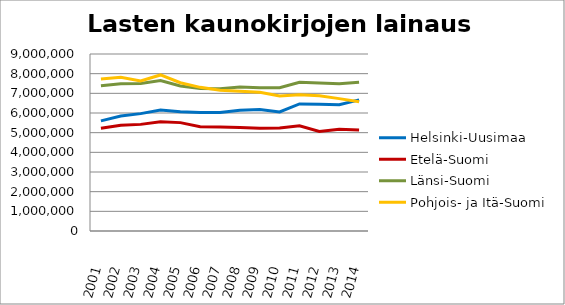
| Category | Helsinki-Uusimaa | Etelä-Suomi | Länsi-Suomi | Pohjois- ja Itä-Suomi |
|---|---|---|---|---|
| 2001.0 | 5598473 | 5223744 | 7386191 | 7727132 |
| 2002.0 | 5845775 | 5381526 | 7492269 | 7822712 |
| 2003.0 | 5967536 | 5421565 | 7502974 | 7631800 |
| 2004.0 | 6152124 | 5553256 | 7655005 | 7934424 |
| 2005.0 | 6060521 | 5510690 | 7373389 | 7538641 |
| 2006.0 | 6031595 | 5306095 | 7248917 | 7303926 |
| 2007.0 | 6019961 | 5285320 | 7233239 | 7153245 |
| 2008.0 | 6137574 | 5264498 | 7326391 | 7104299 |
| 2009.0 | 6180917 | 5230311 | 7286632 | 7055877 |
| 2010.0 | 6052951 | 5231723 | 7284008 | 6865479 |
| 2011.0 | 6459493 | 5348418 | 7564698 | 6925778 |
| 2012.0 | 6442378 | 5062158 | 7520354 | 6878240 |
| 2013.0 | 6424818 | 5170659 | 7491878 | 6730356 |
| 2014.0 | 6668268 | 5138988 | 7561275 | 6567288 |